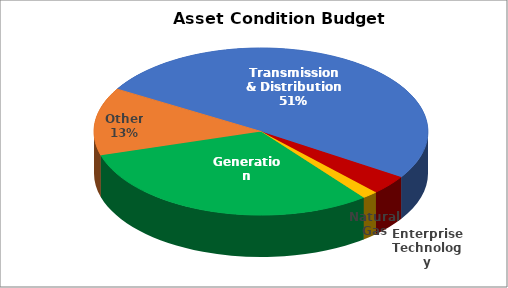
| Category | Series 1 | Series 0 |
|---|---|---|
| Enterprise Technology | 26775000 | 182621615 |
| Natural Gas | 10860000 | 26710000 |
| Generation | 218982538 | 4790000 |
| Other | 92547338 | 76335166 |
| Transmission & Distribution | 359034600 | 113512500 |